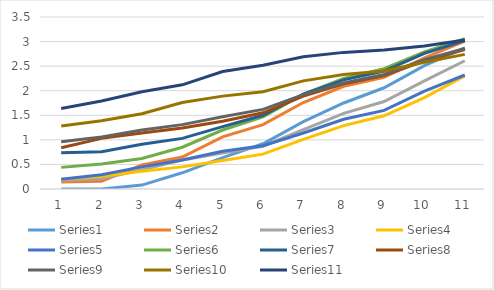
| Category | Series 0 | Series 1 | Series 2 | Series 3 | Series 4 | Series 5 | Series 6 | Series 7 | Series 8 | Series 9 | Series 10 |
|---|---|---|---|---|---|---|---|---|---|---|---|
| 0 | 0 | 0.14 | 0.18 | 0.2 | 0.2 | 0.44 | 0.74 | 0.84 | 0.96 | 1.28 | 1.64 |
| 1 | 0 | 0.16 | 0.21 | 0.26 | 0.29 | 0.51 | 0.76 | 1.03 | 1.06 | 1.39 | 1.79 |
| 2 | 0.08 | 0.49 | 0.39 | 0.36 | 0.45 | 0.62 | 0.91 | 1.14 | 1.2 | 1.53 | 1.98 |
| 3 | 0.33 | 0.65 | 0.59 | 0.45 | 0.59 | 0.85 | 1.03 | 1.24 | 1.31 | 1.76 | 2.12 |
| 4 | 0.64 | 1.06 | 0.73 | 0.58 | 0.77 | 1.2 | 1.27 | 1.38 | 1.47 | 1.89 | 2.39 |
| 5 | 0.92 | 1.31 | 0.87 | 0.71 | 0.88 | 1.47 | 1.5 | 1.55 | 1.62 | 1.98 | 2.52 |
| 6 | 1.37 | 1.76 | 1.21 | 1.01 | 1.14 | 1.93 | 1.93 | 1.89 | 1.92 | 2.2 | 2.69 |
| 7 | 1.75 | 2.09 | 1.54 | 1.29 | 1.42 | 2.25 | 2.22 | 2.14 | 2.16 | 2.33 | 2.78 |
| 8 | 2.06 | 2.27 | 1.78 | 1.49 | 1.6 | 2.45 | 2.4 | 2.31 | 2.33 | 2.4 | 2.83 |
| 9 | 2.51 | 2.67 | 2.2 | 1.86 | 1.99 | 2.79 | 2.76 | 2.61 | 2.63 | 2.58 | 2.91 |
| 10 | 2.87 | 3.01 | 2.61 | 2.3 | 2.32 | 3.06 | 3.02 | 2.84 | 2.86 | 2.74 | 3.03 |